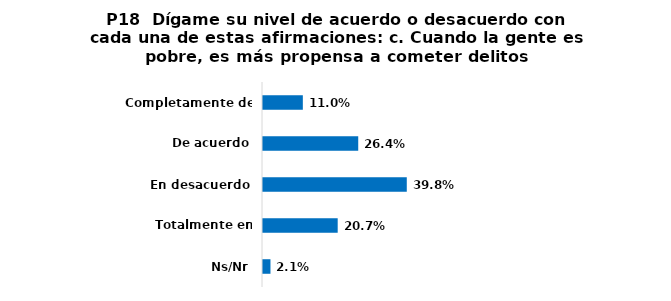
| Category | Series 0 |
|---|---|
| Completamente de acuerdo | 0.11 |
| De acuerdo | 0.264 |
| En desacuerdo | 0.398 |
| Totalmente en desacuerdo | 0.207 |
| Ns/Nr | 0.021 |